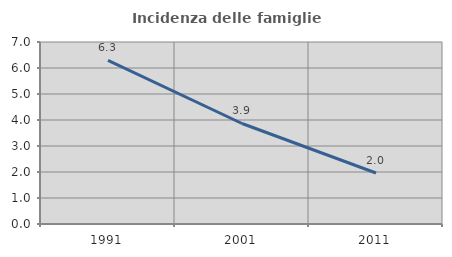
| Category | Incidenza delle famiglie numerose |
|---|---|
| 1991.0 | 6.293 |
| 2001.0 | 3.866 |
| 2011.0 | 1.961 |